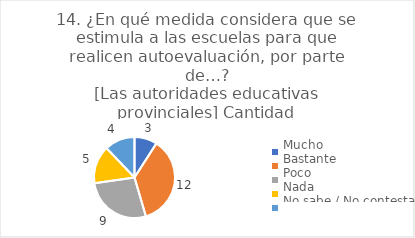
| Category | 14. ¿En qué medida considera que se estimula a las escuelas para que realicen autoevaluación, por parte de…?
[Las autoridades educativas provinciales] |
|---|---|
| Mucho  | 0.091 |
| Bastante  | 0.364 |
| Poco  | 0.273 |
| Nada  | 0.152 |
| No sabe / No contesta | 0.121 |